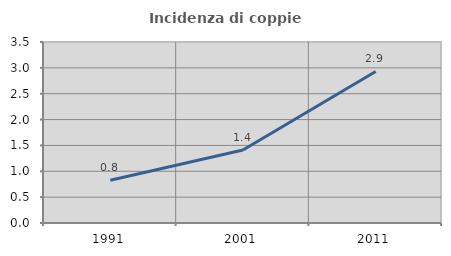
| Category | Incidenza di coppie miste |
|---|---|
| 1991.0 | 0.826 |
| 2001.0 | 1.411 |
| 2011.0 | 2.931 |